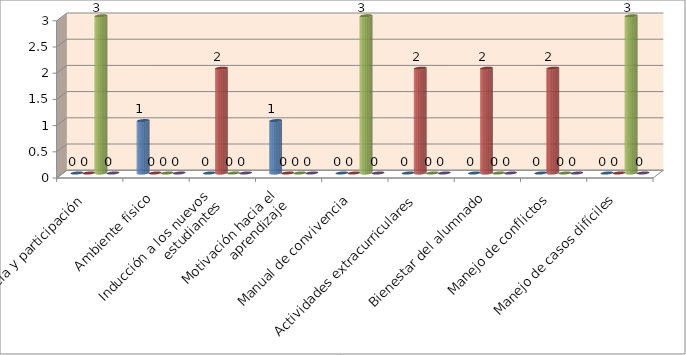
| Category | Series 0 | Series 1 | Series 2 | Series 3 |
|---|---|---|---|---|
| Pertenencia y participación | 0 | 0 | 3 | 0 |
| Ambiente físico | 1 | 0 | 0 | 0 |
| Inducción a los nuevos
estudiantes | 0 | 2 | 0 | 0 |
| Motivación hacia el
aprendizaje | 1 | 0 | 0 | 0 |
| Manual de convivencia | 0 | 0 | 3 | 0 |
| Actividades extracurriculares | 0 | 2 | 0 | 0 |
| Bienestar del alumnado | 0 | 2 | 0 | 0 |
| Manejo de conflictos | 0 | 2 | 0 | 0 |
| Manejo de casos difíciles | 0 | 0 | 3 | 0 |